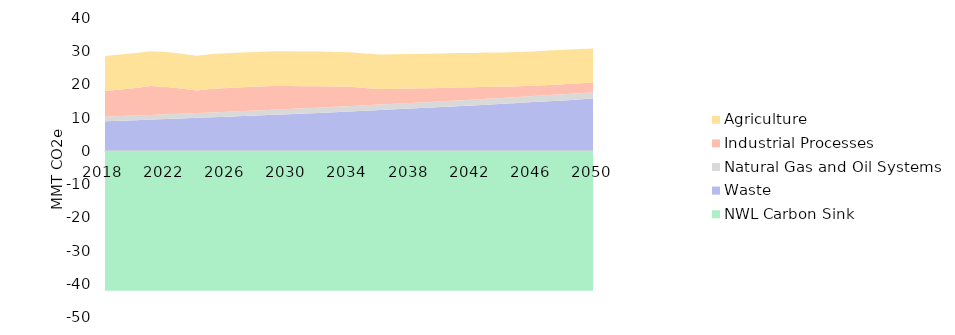
| Category | Waste | Natural Gas and Oil Systems | Industrial Processes | Agriculture |
|---|---|---|---|---|
| 2018.0 | 8.93 | 1.37 | 7.73 | 10.52 |
| 2019.0 | 9.09 | 1.38 | 8.04 | 10.52 |
| 2020.0 | 9.25 | 1.4 | 8.28 | 10.51 |
| 2021.0 | 9.42 | 1.41 | 8.67 | 10.5 |
| 2022.0 | 9.59 | 1.43 | 8.22 | 10.49 |
| 2023.0 | 9.76 | 1.44 | 7.55 | 10.49 |
| 2024.0 | 9.94 | 1.46 | 6.78 | 10.48 |
| 2025.0 | 10.11 | 1.47 | 7.09 | 10.47 |
| 2026.0 | 10.3 | 1.49 | 7.13 | 10.46 |
| 2027.0 | 10.48 | 1.5 | 7.14 | 10.46 |
| 2028.0 | 10.67 | 1.52 | 7.16 | 10.45 |
| 2029.0 | 10.86 | 1.53 | 7.17 | 10.43 |
| 2030.0 | 11.05 | 1.55 | 6.96 | 10.44 |
| 2031.0 | 11.24 | 1.57 | 6.68 | 10.42 |
| 2032.0 | 11.44 | 1.58 | 6.44 | 10.42 |
| 2033.0 | 11.65 | 1.6 | 6.12 | 10.42 |
| 2034.0 | 11.86 | 1.61 | 5.8 | 10.4 |
| 2035.0 | 12.08 | 1.63 | 5.22 | 10.4 |
| 2036.0 | 12.29 | 1.65 | 4.71 | 10.39 |
| 2037.0 | 12.51 | 1.67 | 4.52 | 10.38 |
| 2038.0 | 12.73 | 1.68 | 4.34 | 10.38 |
| 2039.0 | 12.96 | 1.7 | 4.22 | 10.38 |
| 2040.0 | 13.19 | 1.72 | 4.03 | 10.37 |
| 2041.0 | 13.43 | 1.74 | 3.91 | 10.36 |
| 2042.0 | 13.67 | 1.75 | 3.71 | 10.36 |
| 2043.0 | 13.92 | 1.77 | 3.58 | 10.35 |
| 2044.0 | 14.16 | 1.79 | 3.35 | 10.34 |
| 2045.0 | 14.42 | 1.81 | 3.24 | 10.33 |
| 2046.0 | 14.68 | 1.83 | 3.1 | 10.33 |
| 2047.0 | 14.94 | 1.85 | 3.07 | 10.32 |
| 2048.0 | 15.2 | 1.87 | 3.02 | 10.32 |
| 2049.0 | 15.48 | 1.89 | 2.98 | 10.31 |
| 2050.0 | 15.76 | 1.91 | 2.85 | 10.29 |